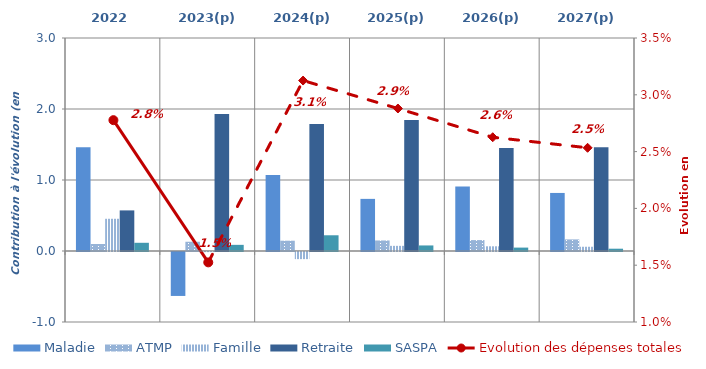
| Category | Maladie | ATMP | Famille | Retraite | SASPA |
|---|---|---|---|---|---|
| 2022 | 1.462 | 0.099 | 0.454 | 0.572 | 0.116 |
| 2023(p) | -0.619 | 0.13 | -0.002 | 1.929 | 0.087 |
| 2024(p) | 1.071 | 0.145 | -0.1 | 1.788 | 0.222 |
| 2025(p) | 0.734 | 0.148 | 0.073 | 1.846 | 0.078 |
| 2026(p) | 0.908 | 0.154 | 0.066 | 1.451 | 0.048 |
| 2027(p) | 0.818 | 0.163 | 0.06 | 1.46 | 0.032 |